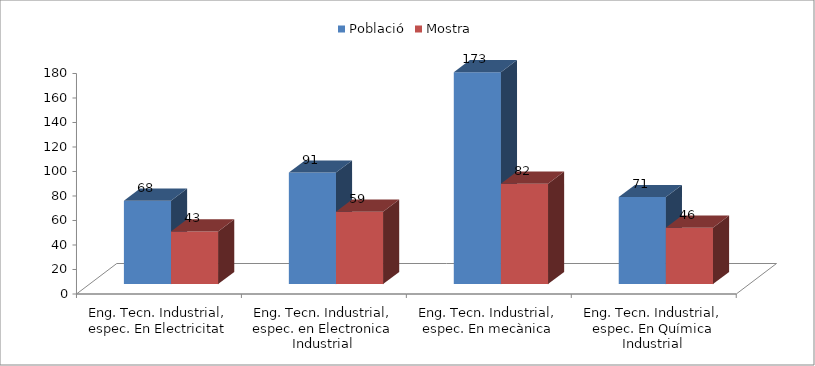
| Category | Població | Mostra |
|---|---|---|
| Eng. Tecn. Industrial, espec. En Electricitat | 68 | 43 |
| Eng. Tecn. Industrial, espec. en Electronica Industrial | 91 | 59 |
| Eng. Tecn. Industrial, espec. En mecànica | 173 | 82 |
| Eng. Tecn. Industrial, espec. En Química Industrial | 71 | 46 |